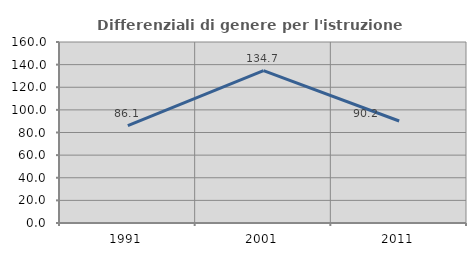
| Category | Differenziali di genere per l'istruzione superiore |
|---|---|
| 1991.0 | 86.124 |
| 2001.0 | 134.707 |
| 2011.0 | 90.176 |